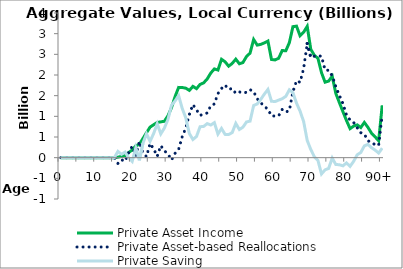
| Category | Private Asset Income | Private Asset-based Reallocations | Private Saving |
|---|---|---|---|
| 0 | 0 | 0.067 | -0.067 |
|  | 0 | 0.065 | -0.065 |
| 2 | 0 | 0.065 | -0.065 |
| 3 | 0 | 0.062 | -0.062 |
| 4 | 0 | -0.06 | 0.06 |
| 5 | 0 | -0.066 | 0.066 |
| 6 | 0 | -0.009 | 0.009 |
| 7 | 0 | -0.122 | 0.122 |
| 8 | 0 | -0.008 | 0.008 |
| 9 | 0 | -0.005 | 0.005 |
| 10 | 0 | -0.026 | 0.026 |
| 11 | 0 | -0.091 | 0.091 |
| 12 | 0 | -0.013 | 0.013 |
| 13 | 0 | -0.119 | 0.119 |
| 14 | 0 | -0.131 | 0.131 |
| 15 | 0 | 0.083 | -0.083 |
| 16 | 12.341 | -138.844 | 151.185 |
| 17 | 30.325 | -51.056 | 81.381 |
| 18 | 49.12 | -86.5 | 135.62 |
| 19 | 123.823 | 123.022 | 0.801 |
| 20 | 185.127 | 274.905 | -89.779 |
| 21 | 287.003 | 46.72 | 240.283 |
| 22 | 322.248 | 387.125 | -64.877 |
| 23 | 463.557 | 116.102 | 347.455 |
| 24 | 604.007 | 25.093 | 578.914 |
| 25 | 738.91 | 343.228 | 395.682 |
| 26 | 796.532 | 212.449 | 584.083 |
| 27 | 853.456 | 31.823 | 821.633 |
| 28 | 866.049 | 291.252 | 574.797 |
| 29 | 880.654 | 165.788 | 714.866 |
| 30 | 1014.12 | 89.858 | 924.261 |
| 31 | 1208.741 | -58.169 | 1266.909 |
| 32 | 1477.551 | 105.607 | 1371.944 |
| 33 | 1699.978 | 200.766 | 1499.212 |
| 34 | 1697.139 | 505.177 | 1191.962 |
| 35 | 1681.357 | 718.3 | 963.056 |
| 36 | 1627.385 | 1044.504 | 582.88 |
| 37 | 1724.483 | 1284.716 | 439.766 |
| 38 | 1669.785 | 1157.467 | 512.318 |
| 39 | 1771.561 | 1023.369 | 748.192 |
| 40 | 1810.171 | 1054.338 | 755.833 |
| 41 | 1904.462 | 1080.338 | 824.124 |
| 42 | 2047.249 | 1257.132 | 790.117 |
| 43 | 2147.432 | 1300.773 | 846.66 |
| 44 | 2120.245 | 1549.524 | 570.722 |
| 45 | 2380.729 | 1673.841 | 706.888 |
| 46 | 2319.272 | 1756.043 | 563.228 |
| 47 | 2213.362 | 1653.909 | 559.453 |
| 48 | 2280.325 | 1672.902 | 607.422 |
| 49 | 2383.436 | 1554.393 | 829.043 |
| 50 | 2272.762 | 1591.061 | 681.701 |
| 51 | 2301.484 | 1564.007 | 737.477 |
| 52 | 2446.396 | 1582.485 | 863.911 |
| 53 | 2529.963 | 1645.425 | 884.538 |
| 54 | 2859.355 | 1597.1 | 1262.255 |
| 55 | 2723.137 | 1423.226 | 1299.911 |
| 56 | 2741.378 | 1329.423 | 1411.955 |
| 57 | 2776.995 | 1239.498 | 1537.496 |
| 58 | 2821.649 | 1171.101 | 1650.547 |
| 59 | 2375.35 | 1010.374 | 1364.976 |
| 60 | 2364.71 | 1007.23 | 1357.48 |
| 61 | 2405.81 | 1012.963 | 1392.847 |
| 62 | 2592.293 | 1166.584 | 1425.709 |
| 63 | 2585.462 | 1102.783 | 1482.679 |
| 64 | 2782.206 | 1140.915 | 1641.291 |
| 65 | 3169.772 | 1597.91 | 1571.861 |
| 66 | 3182.172 | 1862.8 | 1319.371 |
| 67 | 2948.712 | 1822.319 | 1126.393 |
| 68 | 3035.125 | 2161.362 | 873.763 |
| 69 | 3176.917 | 2760.953 | 415.965 |
| 70 | 2620.931 | 2423.351 | 197.581 |
| 71 | 2477.166 | 2455.13 | 22.036 |
| 72 | 2403.537 | 2469.559 | -66.021 |
| 73 | 2056.484 | 2450.784 | -394.3 |
| 74 | 1826.734 | 2121.279 | -294.545 |
| 75 | 1852.839 | 2113.334 | -260.495 |
| 76 | 1972.046 | 1981.124 | -9.078 |
| 77 | 1556.159 | 1720.211 | -164.051 |
| 78 | 1333.049 | 1504.364 | -171.315 |
| 79 | 1112.949 | 1310.251 | -197.302 |
| 80 | 898.175 | 1025.766 | -127.59 |
| 81 | 701.778 | 911.951 | -210.174 |
| 82 | 763.369 | 851.524 | -88.155 |
| 83 | 793.592 | 724.06 | 69.533 |
| 84 | 729.065 | 603.827 | 125.237 |
| 85 | 852.299 | 567.723 | 284.576 |
| 86 | 733.344 | 412.015 | 321.33 |
| 87 | 592.104 | 351.384 | 240.72 |
| 88 | 503.706 | 320.717 | 182.989 |
| 89 | 408.652 | 296.265 | 112.387 |
| 90+ | 1267.443 | 1037.275 | 230.168 |